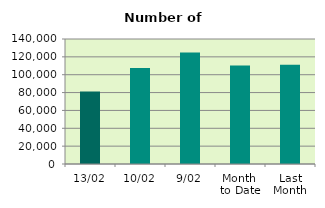
| Category | Series 0 |
|---|---|
| 13/02 | 81090 |
| 10/02 | 107524 |
| 9/02 | 124856 |
| Month 
to Date | 110284 |
| Last
Month | 111077.545 |